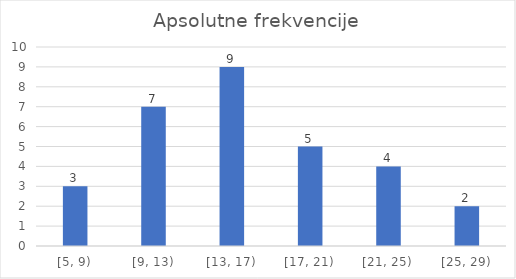
| Category | Apsolutne frekvencije |
|---|---|
| [5, 9) | 3 |
| [9, 13) | 7 |
| [13, 17) | 9 |
| [17, 21) | 5 |
| [21, 25) | 4 |
| [25, 29) | 2 |